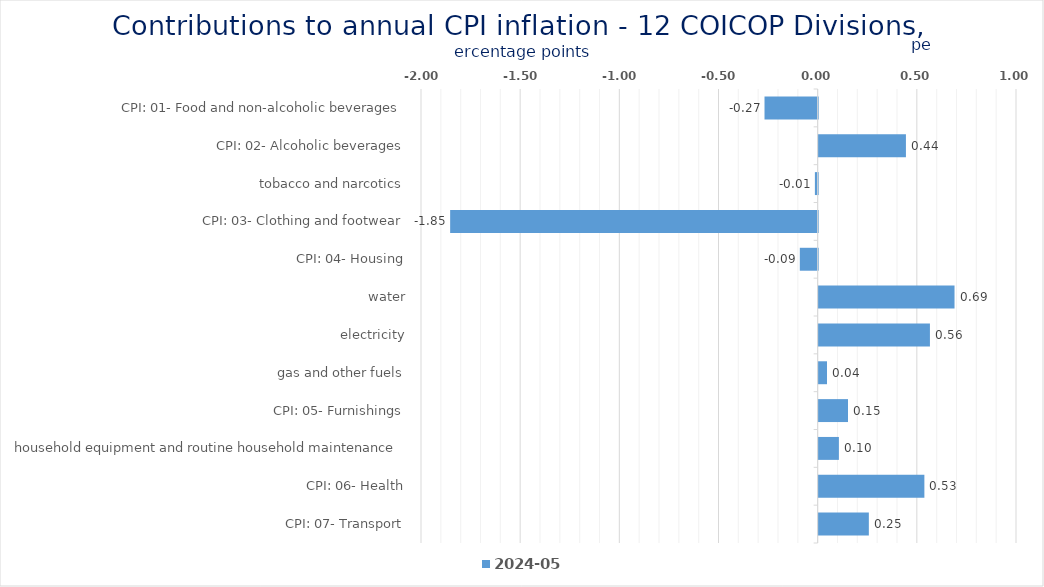
| Category | 2024-05 |
|---|---|
| CPI: 01- Food and non-alcoholic beverages | -0.268 |
| CPI: 02- Alcoholic beverages, tobacco and narcotics | 0.44 |
| CPI: 03- Clothing and footwear | -0.014 |
| CPI: 04- Housing, water, electricity, gas and other fuels | -1.853 |
| CPI: 05- Furnishings, household equipment and routine household maintenance | -0.09 |
| CPI: 06- Health | 0.685 |
| CPI: 07- Transport | 0.561 |
| CPI: 08- Communication | 0.042 |
| CPI: 09- Recreation and culture | 0.148 |
| CPI: 10- Education | 0.102 |
| CPI: 11- Restaurants and hotels | 0.533 |
| CPI: 12- Miscellaneous goods and services | 0.253 |